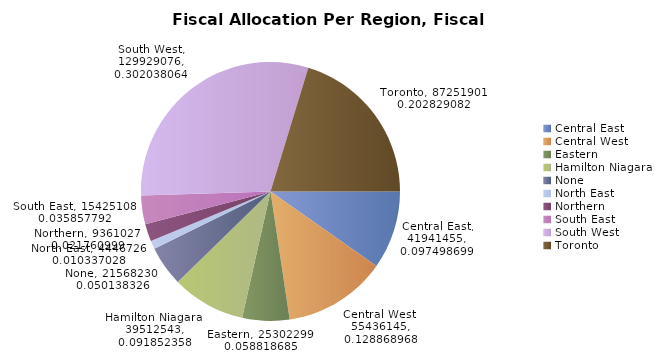
| Category | Fiscal Subsidy |
|---|---|
| Central East | 41941455 |
| Central West | 55436145 |
| Eastern | 25302299 |
| Hamilton Niagara | 39512543 |
| None | 21568230 |
| North East | 4446726 |
| Northern | 9361027 |
| South East | 15425108 |
| South West | 129929076 |
| Toronto | 87251901 |